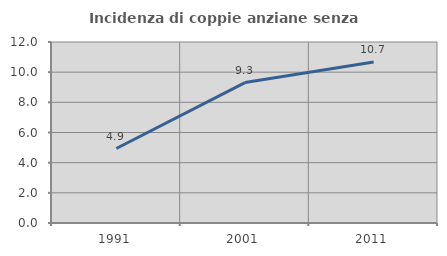
| Category | Incidenza di coppie anziane senza figli  |
|---|---|
| 1991.0 | 4.938 |
| 2001.0 | 9.312 |
| 2011.0 | 10.672 |